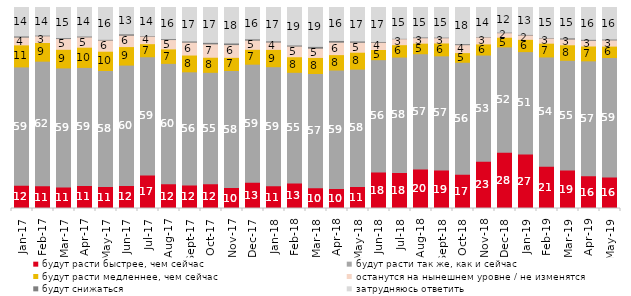
| Category | будут расти быстрее, чем сейчас | будут расти так же, как и сейчас | будут расти медленнее, чем сейчас | останутся на нынешнем уровне / не изменятся | будут снижаться | затрудняюсь ответить |
|---|---|---|---|---|---|---|
| 2017-01-01 | 11.6 | 58.85 | 10.95 | 3.85 | 0.6 | 14.15 |
| 2017-02-01 | 11.35 | 61.95 | 9.3 | 3.3 | 0.35 | 13.75 |
| 2017-03-01 | 10.7 | 59.25 | 9.25 | 5.35 | 0.45 | 15 |
| 2017-04-01 | 11.45 | 58.75 | 10.05 | 5.1 | 0.45 | 14.2 |
| 2017-05-01 | 11 | 57.65 | 9.6 | 5.55 | 0.35 | 15.85 |
| 2017-06-01 | 11.5 | 59.85 | 9.2 | 5.65 | 0.7 | 13.1 |
| 2017-07-01 | 16.7 | 58.8 | 6.5 | 3.75 | 0.25 | 14 |
| 2017-08-01 | 12.35 | 59.85 | 7.2 | 4.65 | 0.45 | 15.5 |
| 2017-09-01 | 11.75 | 56.25 | 8.35 | 6.4 | 0.6 | 16.65 |
| 2017-10-01 | 12.3 | 55.45 | 7.5 | 6.65 | 0.75 | 17.35 |
| 2017-11-01 | 10.4 | 58.25 | 6.55 | 6.35 | 0.8 | 17.65 |
| 2017-12-01 | 13.1 | 58.7 | 7.4 | 4.55 | 0.65 | 15.6 |
| 2018-01-01 | 11.35 | 59.2 | 8.6 | 3.65 | 0.6 | 16.6 |
| 2018-02-01 | 12.7 | 55.05 | 7.75 | 5.3 | 0.55 | 18.65 |
| 2018-03-01 | 10.3 | 56.85 | 8 | 4.6 | 0.9 | 19.35 |
| 2018-04-01 | 9.9 | 59 | 7.65 | 6.2 | 0.85 | 16.4 |
| 2018-05-01 | 10.95 | 58.4 | 8.4 | 4.95 | 0.65 | 16.65 |
| 2018-06-01 | 18.15 | 55.9 | 5.05 | 3.6 | 0.4 | 16.9 |
| 2018-07-01 | 17.85 | 57.5 | 6.15 | 2.95 | 0.2 | 15.35 |
| 2018-08-01 | 19.65 | 57.35 | 5.25 | 2.7 | 0.4 | 14.65 |
| 2018-09-01 | 19.1 | 56.85 | 6.4 | 2.6 | 0.3 | 14.75 |
| 2018-10-01 | 17.1 | 55.65 | 4.8 | 3.95 | 0.5 | 18 |
| 2018-11-01 | 23.453 | 52.894 | 5.539 | 3.443 | 0.2 | 14.471 |
| 2018-12-01 | 27.95 | 52.45 | 4.8 | 2.25 | 0.3 | 12.25 |
| 2019-01-01 | 27.15 | 50.9 | 6.1 | 2.15 | 0.3 | 13.4 |
| 2019-02-01 | 21.05 | 54.35 | 6.85 | 2.55 | 0.2 | 15 |
| 2019-03-01 | 19.095 | 54.649 | 7.708 | 2.834 | 0.597 | 15.117 |
| 2019-04-01 | 16.287 | 57.178 | 7.376 | 2.822 | 0.495 | 15.842 |
| 2019-05-01 | 15.701 | 59.435 | 5.646 | 3.071 | 0.446 | 15.701 |